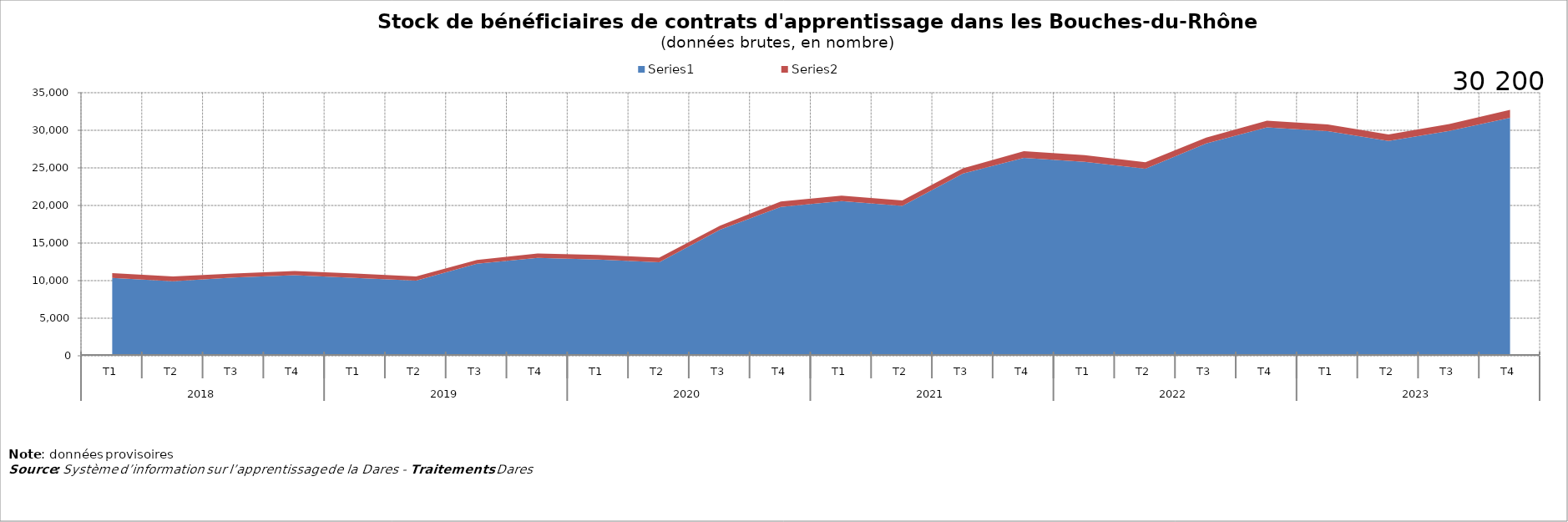
| Category | Series 0 | Series 1 |
|---|---|---|
| 0 | 10348 | 650 |
| 1 | 9917 | 642 |
| 2 | 10407 | 524 |
| 3 | 10714 | 575 |
| 4 | 10374 | 562 |
| 5 | 9993 | 550 |
| 6 | 12249 | 514 |
| 7 | 13025 | 593 |
| 8 | 12812 | 593 |
| 9 | 12456 | 588 |
| 10 | 16781 | 538 |
| 11 | 19808 | 730 |
| 12 | 20577 | 735 |
| 13 | 19938 | 732 |
| 14 | 24240 | 705 |
| 15 | 26321 | 894 |
| 16 | 25813 | 885 |
| 17 | 24891 | 861 |
| 18 | 28238 | 802 |
| 19 | 30389 | 885 |
| 20 | 29900 | 874 |
| 21 | 28593 | 860 |
| 22 | 29922 | 906 |
| 23 | 31674 | 1040 |